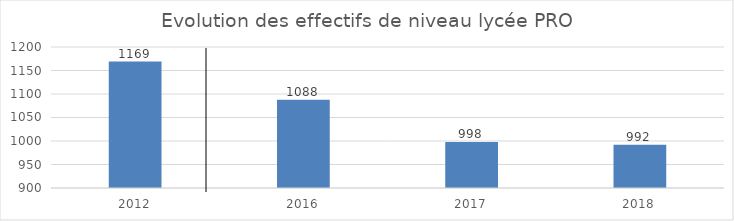
| Category | Series 0 |
|---|---|
| 2012.0 | 1169 |
| 2016.0 | 1088 |
| 2017.0 | 998 |
| 2018.0 | 992 |